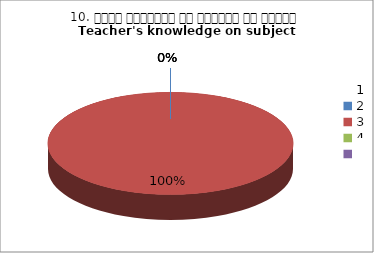
| Category | 10. विषय अवधारणा पर शिक्षक का ज्ञान
Teacher's knowledge on subject concept?
 |
|---|---|
| 0 | 0 |
| 1 | 4 |
| 2 | 0 |
| 3 | 0 |
| 4 | 0 |